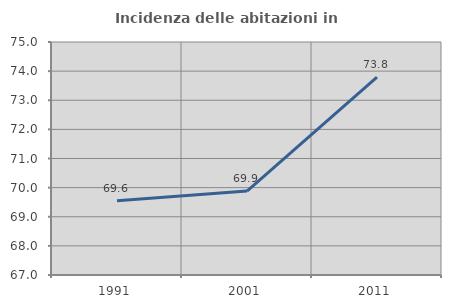
| Category | Incidenza delle abitazioni in proprietà  |
|---|---|
| 1991.0 | 69.552 |
| 2001.0 | 69.883 |
| 2011.0 | 73.79 |